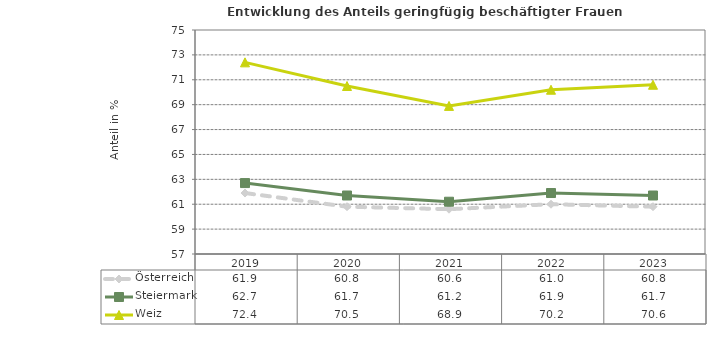
| Category | Österreich | Steiermark | Weiz |
|---|---|---|---|
| 2023.0 | 60.8 | 61.7 | 70.6 |
| 2022.0 | 61 | 61.9 | 70.2 |
| 2021.0 | 60.6 | 61.2 | 68.9 |
| 2020.0 | 60.8 | 61.7 | 70.5 |
| 2019.0 | 61.9 | 62.7 | 72.4 |